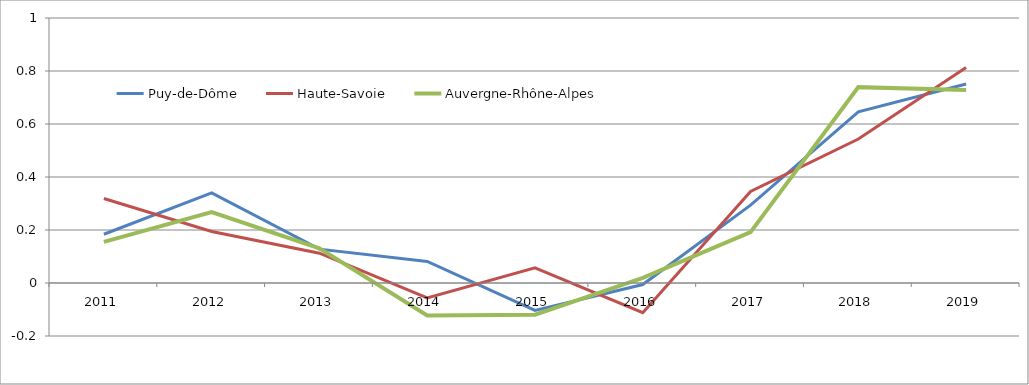
| Category | Puy-de-Dôme | Haute-Savoie | Auvergne-Rhône-Alpes |
|---|---|---|---|
| 2011 | 0.184 | 0.319 | 0.155 |
| 2012 | 0.34 | 0.194 | 0.268 |
| 2013 | 0.128 | 0.112 | 0.131 |
| 2014 | 0.081 | -0.056 | -0.123 |
| 2015 | -0.103 | 0.058 | -0.12 |
| 2016 | -0.006 | -0.112 | 0.019 |
| 2017 | 0.294 | 0.346 | 0.192 |
| 2018 | 0.646 | 0.543 | 0.739 |
| 2019 | 0.751 | 0.813 | 0.728 |